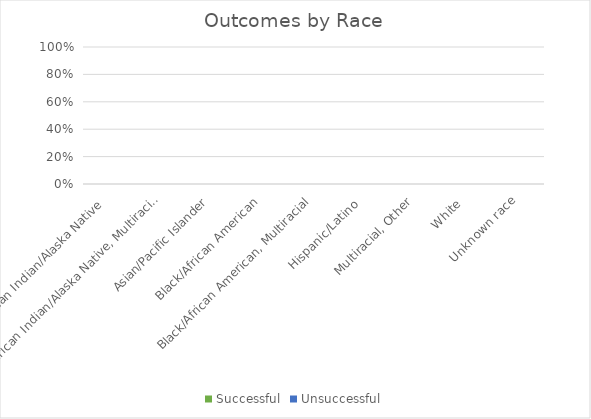
| Category | Successful | Unsuccessful |
|---|---|---|
| American Indian/Alaska Native  | 0 | 0 |
| American Indian/Alaska Native, Multiracial | 0 | 0 |
| Asian/Pacific Islander | 0 | 0 |
| Black/African American | 0 | 0 |
| Black/African American, Multiracial | 0 | 0 |
| Hispanic/Latino  | 0 | 0 |
| Multiracial, Other | 0 | 0 |
| White  | 0 | 0 |
| Unknown race | 0 | 0 |